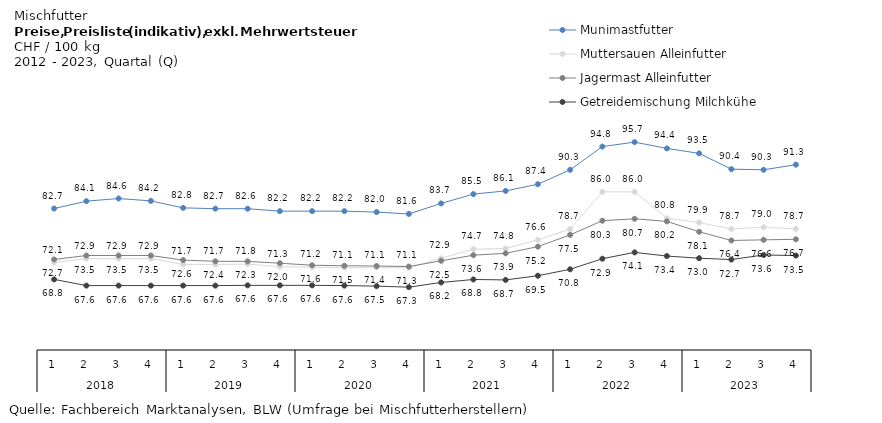
| Category | Munimastfutter | Muttersauen Alleinfutter | Jagermast Alleinfutter | Getreidemischung Milchkühe |
|---|---|---|---|---|
| 0 | 82.676 | 72.112 | 72.708 | 68.814 |
| 1 | 84.117 | 72.876 | 73.484 | 67.601 |
| 2 | 84.64 | 72.876 | 73.484 | 67.601 |
| 3 | 84.172 | 72.876 | 73.484 | 67.601 |
| 4 | 82.808 | 71.747 | 72.587 | 67.601 |
| 5 | 82.651 | 71.747 | 72.352 | 67.601 |
| 6 | 82.64 | 71.799 | 72.34 | 67.646 |
| 7 | 82.164 | 71.291 | 71.981 | 67.646 |
| 8 | 82.164 | 71.232 | 71.586 | 67.646 |
| 9 | 82.164 | 71.1 | 71.487 | 67.601 |
| 10 | 81.982 | 71.097 | 71.432 | 67.499 |
| 11 | 81.618 | 71.091 | 71.322 | 67.293 |
| 12 | 83.679 | 72.944 | 72.453 | 68.213 |
| 13 | 85.499 | 74.724 | 73.552 | 68.799 |
| 14 | 86.126 | 74.849 | 73.918 | 68.71 |
| 15 | 87.433 | 76.559 | 75.223 | 69.531 |
| 16 | 90.26 | 78.65 | 77.53 | 70.79 |
| 17 | 94.8 | 85.95 | 80.3 | 72.86 |
| 18 | 95.67 | 85.95 | 80.67 | 74.1 |
| 19 | 94.44 | 80.78 | 80.16 | 73.38 |
| 20 | 93.47 | 79.94 | 78.13 | 72.96 |
| 21 | 90.38 | 78.68 | 76.43 | 72.7 |
| 22 | 90.26 | 79.01 | 76.55 | 73.59 |
| 23 | 91.26 | 78.69 | 76.66 | 73.48 |